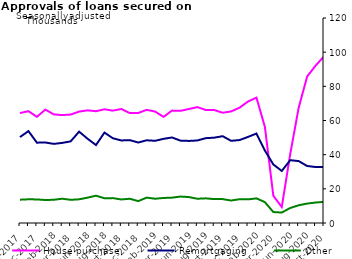
| Category | House purchase | Remortgaging | Other |
|---|---|---|---|
| Oct-2017 | 64369 | 50309 | 13646 |
| Nov-2017 | 65454 | 53800 | 13870 |
| Dec-2017 | 62142 | 47030 | 13805 |
| Jan-2018 | 66385 | 47125 | 13443 |
| Feb-2018 | 63578 | 46315 | 13604 |
| Mar-2018 | 63166 | 46885 | 14219 |
| Apr-2018 | 63483 | 47792 | 13571 |
| May-2018 | 65210 | 53478 | 13861 |
| Jun-2018 | 65948 | 49325 | 14841 |
| Jul-2018 | 65437 | 45623 | 15989 |
| Aug-2018 | 66554 | 52910 | 14489 |
| Sep-2018 | 65765 | 49602 | 14567 |
| Oct-2018 | 66746 | 48325 | 13784 |
| Nov-2018 | 64363 | 48512 | 14188 |
| Dec-2018 | 64404 | 47108 | 12821 |
| Jan-2019 | 66230 | 48416 | 14851 |
| Feb-2019 | 65236 | 48114 | 14209 |
| Mar-2019 | 62126 | 49267 | 14651 |
| Apr-2019 | 65797 | 50067 | 14839 |
| May-2019 | 65642 | 48224 | 15473 |
| Jun-2019 | 66729 | 48047 | 15180 |
| Jul-2019 | 67840 | 48309 | 14198 |
| Aug-2019 | 66170 | 49658 | 14438 |
| Sep-2019 | 66115 | 49951 | 13977 |
| Oct-2019 | 64553 | 50820 | 13975 |
| Nov-2019 | 65297 | 48106 | 13161 |
| Dec-2019 | 67501 | 48554 | 13928 |
| Jan-2020 | 71100 | 50378 | 13829 |
| Feb-2020 | 73384 | 52378 | 14415 |
| Mar-2020 | 56246 | 42417 | 12221 |
| Apr-2020 | 15919 | 34247 | 6403 |
| May-2020 | 9355 | 30471 | 6120 |
| Jun-2020 | 40357 | 36769 | 8799 |
| Jul-2020 | 67433 | 36241 | 10369 |
| Aug-2020 | 85704 | 33376 | 11360 |
| Sep-2020 | 92091 | 32773 | 11984 |
| Oct-2020 | 97532 | 32851 | 12376 |